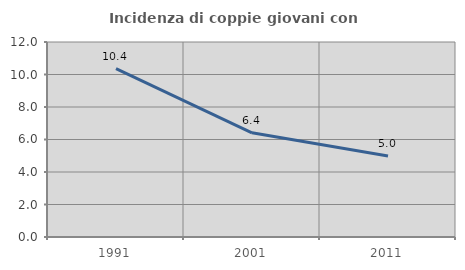
| Category | Incidenza di coppie giovani con figli |
|---|---|
| 1991.0 | 10.356 |
| 2001.0 | 6.41 |
| 2011.0 | 4.99 |